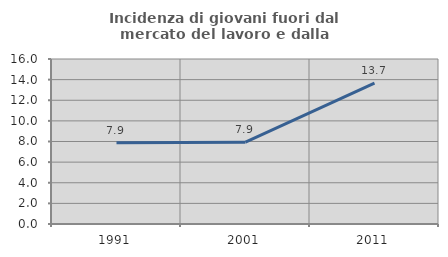
| Category | Incidenza di giovani fuori dal mercato del lavoro e dalla formazione  |
|---|---|
| 1991.0 | 7.868 |
| 2001.0 | 7.932 |
| 2011.0 | 13.651 |